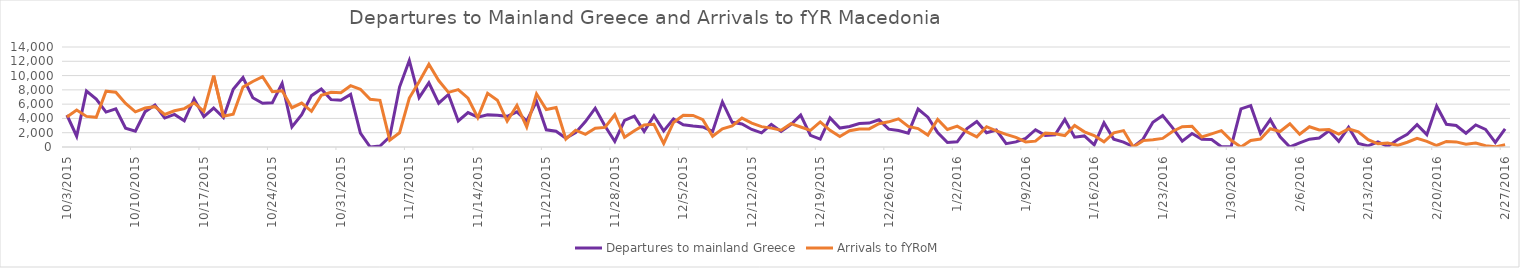
| Category | Departures to mainland Greece | Arrivals to fYRoM |
|---|---|---|
| 10/3/15 | 4480 | 4202 |
| 10/4/15 | 1513 | 5181 |
| 10/5/15 | 7833 | 4282 |
| 10/6/15 | 6707 | 4156 |
| 10/7/15 | 4886 | 7816 |
| 10/8/15 | 5349 | 7663 |
| 10/9/15 | 2631 | 6107 |
| 10/10/15 | 2214 | 4922 |
| 10/11/15 | 4950 | 5448 |
| 10/12/15 | 5879 | 5645 |
| 10/13/15 | 4052 | 4551 |
| 10/14/15 | 4564 | 5073 |
| 10/15/15 | 3660 | 5373 |
| 10/16/15 | 6743 | 6181 |
| 10/17/15 | 4239 | 4988 |
| 10/18/15 | 5457 | 10005 |
| 10/19/15 | 4119 | 4299 |
| 10/20/15 | 8083 | 4584 |
| 10/21/15 | 9725 | 8384 |
| 10/22/15 | 6896 | 9174 |
| 10/23/15 | 6120 | 9840 |
| 10/24/15 | 6195 | 7752 |
| 10/25/15 | 8916 | 7864 |
| 10/26/15 | 2804 | 5500 |
| 10/27/15 | 4540 | 6146 |
| 10/28/15 | 7191 | 5000 |
| 10/29/15 | 8117 | 7231 |
| 10/30/15 | 6649 | 7663 |
| 10/31/15 | 6537 | 7590 |
| 11/1/15 | 7360 | 8584 |
| 11/2/15 | 1935 | 8075 |
| 11/3/15 | 0 | 6682 |
| 11/4/15 | 142 | 6532 |
| 11/5/15 | 1430 | 960 |
| 11/6/15 | 8392 | 1987 |
| 11/7/15 | 12116 | 6847 |
| 11/8/15 | 6902 | 9148 |
| 11/9/15 | 8977 | 11572 |
| 11/10/15 | 6133 | 9305 |
| 11/11/15 | 7354 | 7651 |
| 11/12/15 | 3650 | 8038 |
| 11/13/15 | 4820 | 6826 |
| 11/14/15 | 4171 | 4107 |
| 11/15/15 | 4497 | 7511 |
| 11/16/15 | 4442 | 6557 |
| 11/17/15 | 4289 | 3621 |
| 11/18/15 | 4927 | 5831 |
| 11/19/15 | 3644 | 2816 |
| 11/20/15 | 6389 | 7453 |
| 11/21/15 | 2401 | 5255 |
| 11/22/15 | 2214 | 5539 |
| 11/23/15 | 1245 | 1113 |
| 11/24/15 | 2006 | 2347 |
| 11/25/15 | 3565 | 1779 |
| 11/26/15 | 5435 | 2617 |
| 11/27/15 | 2932 | 2744 |
| 11/28/15 | 778 | 4520 |
| 11/29/15 | 3736 | 1373 |
| 11/30/15 | 4318 | 2270 |
| 12/1/15 | 2181 | 3094 |
| 12/2/15 | 4384 | 3174 |
| 12/3/15 | 2255 | 494 |
| 12/4/15 | 3934 | 3436 |
| 12/5/15 | 3115 | 4430 |
| 12/6/15 | 2943 | 4425 |
| 12/7/15 | 2810 | 3826 |
| 12/8/15 | 2189 | 1508 |
| 12/9/15 | 6316 | 2550 |
| 12/10/15 | 3456 | 2956 |
| 12/11/15 | 3219 | 4047 |
| 12/12/15 | 2453 | 3338 |
| 12/13/15 | 1976 | 2849 |
| 12/14/15 | 3175 | 2644 |
| 12/15/15 | 2191 | 2349 |
| 12/16/15 | 3137 | 3264 |
| 12/17/15 | 4461 | 2801 |
| 12/18/15 | 1638 | 2332 |
| 12/19/15 | 1110 | 3515 |
| 12/20/15 | 4070 | 2338 |
| 12/21/15 | 2652 | 1470 |
| 12/22/15 | 2864 | 2272 |
| 12/23/15 | 3278 | 2529 |
| 12/24/15 | 3349 | 2529 |
| 12/25/15 | 3806 | 3268 |
| 12/26/15 | 2498 | 3521 |
| 12/27/15 | 2311 | 3938 |
| 12/28/15 | 1946 | 2884 |
| 12/29/15 | 5309 | 2577 |
| 12/30/15 | 4178 | 1665 |
| 12/31/15 | 2009 | 3848 |
| 1/1/16 | 623 | 2454 |
| 1/2/16 | 720 | 2918 |
| 1/3/16 | 2569 | 2112 |
| 1/4/16 | 3563 | 1415 |
| 1/5/16 | 1998 | 2842 |
| 1/6/16 | 2377 | 2258 |
| 1/7/16 | 463 | 1776 |
| 1/8/16 | 716 | 1344 |
| 1/9/16 | 1203 | 715 |
| 1/10/16 | 2417 | 819 |
| 1/11/16 | 1621 | 1959 |
| 1/12/16 | 1701 | 1840 |
| 1/13/16 | 3861 | 1600 |
| 1/14/16 | 1378 | 3022 |
| 1/15/16 | 1551 | 2119 |
| 1/16/16 | 301 | 1598 |
| 1/17/16 | 3378 | 720 |
| 1/18/16 | 1078 | 1980 |
| 1/19/16 | 695 | 2298 |
| 1/20/16 | 50 | 0 |
| 1/21/16 | 1108 | 892 |
| 1/22/16 | 3451 | 1030 |
| 1/23/16 | 4397 | 1208 |
| 1/24/16 | 2706 | 2174 |
| 1/25/16 | 819 | 2836 |
| 1/26/16 | 1887 | 2908 |
| 1/27/16 | 1098 | 1402 |
| 1/28/16 | 1046 | 1837 |
| 1/29/16 | 40 | 2292 |
| 1/30/16 | 53 | 931 |
| 1/31/16 | 5342 | 0 |
| 2/1/16 | 5783 | 908 |
| 2/2/16 | 1878 | 1121 |
| 2/3/16 | 3829 | 2558 |
| 2/4/16 | 1436 | 2173 |
| 2/5/16 | 0 | 3259 |
| 2/6/16 | 578 | 1780 |
| 2/7/16 | 1097 | 2838 |
| 2/8/16 | 1259 | 2392 |
| 2/9/16 | 2283 | 2441 |
| 2/10/16 | 793 | 1817 |
| 2/11/16 | 2756 | 2540 |
| 2/12/16 | 496 | 2115 |
| 2/13/16 | 161 | 1019 |
| 2/14/16 | 724 | 452 |
| 2/15/16 | 65 | 542 |
| 2/16/16 | 1024 | 234 |
| 2/17/16 | 1772 | 668 |
| 2/18/16 | 3118 | 1200 |
| 2/19/16 | 1731 | 799 |
| 2/20/16 | 5738 | 209 |
| 2/21/16 | 3180 | 774 |
| 2/22/16 | 3002 | 714 |
| 2/23/16 | 1927 | 382 |
| 2/24/16 | 3086 | 551 |
| 2/25/16 | 2468 | 168 |
| 2/26/16 | 649 | 20 |
| 2/27/16 | 2525 | 310 |